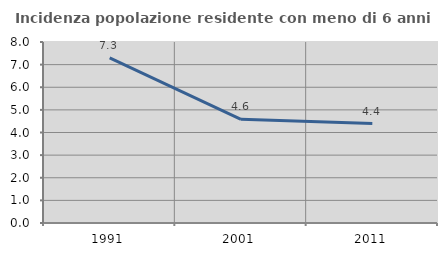
| Category | Incidenza popolazione residente con meno di 6 anni |
|---|---|
| 1991.0 | 7.295 |
| 2001.0 | 4.585 |
| 2011.0 | 4.397 |